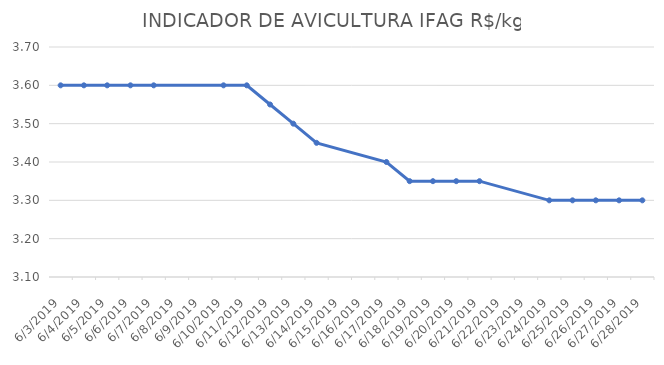
| Category | INDICADOR DE AVICULTURA IFAG |
|---|---|
| 6/3/19 | 3.6 |
| 6/4/19 | 3.6 |
| 6/5/19 | 3.6 |
| 6/6/19 | 3.6 |
| 6/7/19 | 3.6 |
| 6/10/19 | 3.6 |
| 6/11/19 | 3.6 |
| 6/12/19 | 3.55 |
| 6/13/19 | 3.5 |
| 6/14/19 | 3.45 |
| 6/17/19 | 3.4 |
| 6/18/19 | 3.35 |
| 6/19/19 | 3.35 |
| 6/20/19 | 3.35 |
| 6/21/19 | 3.35 |
| 6/24/19 | 3.3 |
| 6/25/19 | 3.3 |
| 6/26/19 | 3.3 |
| 6/27/19 | 3.3 |
| 6/28/19 | 3.3 |